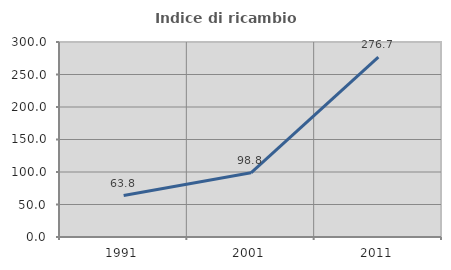
| Category | Indice di ricambio occupazionale  |
|---|---|
| 1991.0 | 63.81 |
| 2001.0 | 98.795 |
| 2011.0 | 276.667 |